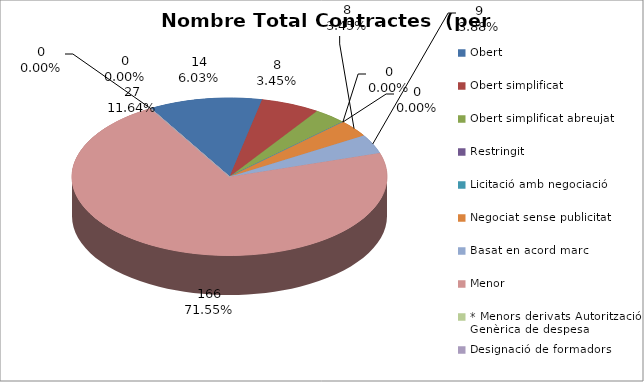
| Category | Nombre Total Contractes |
|---|---|
| Obert | 27 |
| Obert simplificat | 14 |
| Obert simplificat abreujat | 8 |
| Restringit | 0 |
| Licitació amb negociació | 0 |
| Negociat sense publicitat | 8 |
| Basat en acord marc | 9 |
| Menor | 166 |
| * Menors derivats Autorització Genèrica de despesa | 0 |
| Designació de formadors | 0 |